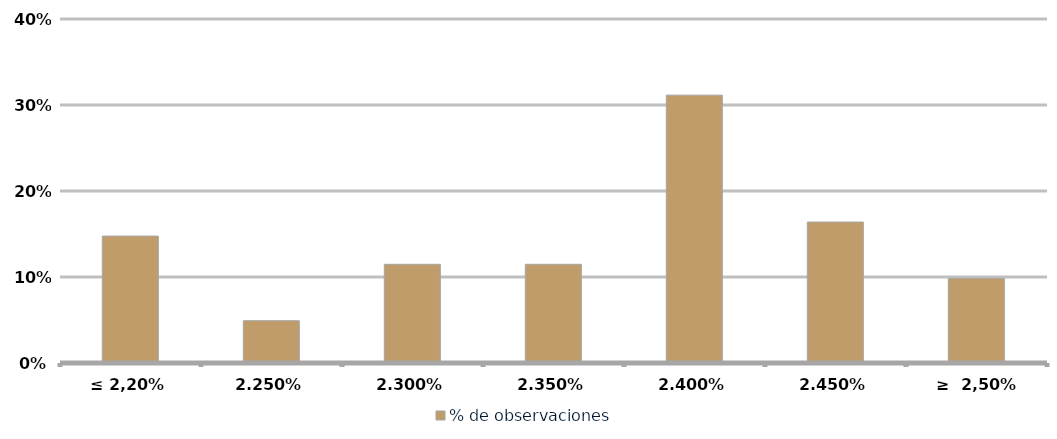
| Category | % de observaciones  |
|---|---|
| ≤ 2,20% | 0.148 |
| 2.25% | 0.049 |
| 2.30% | 0.115 |
| 2.35% | 0.115 |
| 2.40% | 0.311 |
| 2.45% | 0.164 |
| ≥  2,50% | 0.098 |